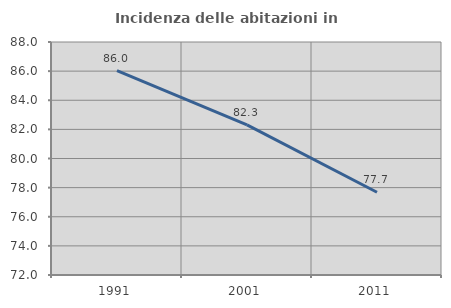
| Category | Incidenza delle abitazioni in proprietà  |
|---|---|
| 1991.0 | 86.032 |
| 2001.0 | 82.303 |
| 2011.0 | 77.684 |